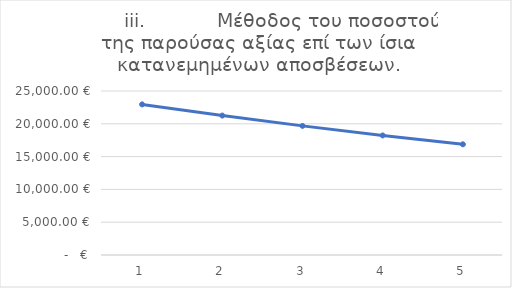
| Category |         iii.            Μέθοδος του ποσοστού της παρούσας αξίας επί των ίσια κατανεμημένων αποσβέσεων. |
|---|---|
| 1.0 | 22958.508 |
| 2.0 | 21257.878 |
| 3.0 | 19683.22 |
| 4.0 | 18225.204 |
| 5.0 | 16875.189 |